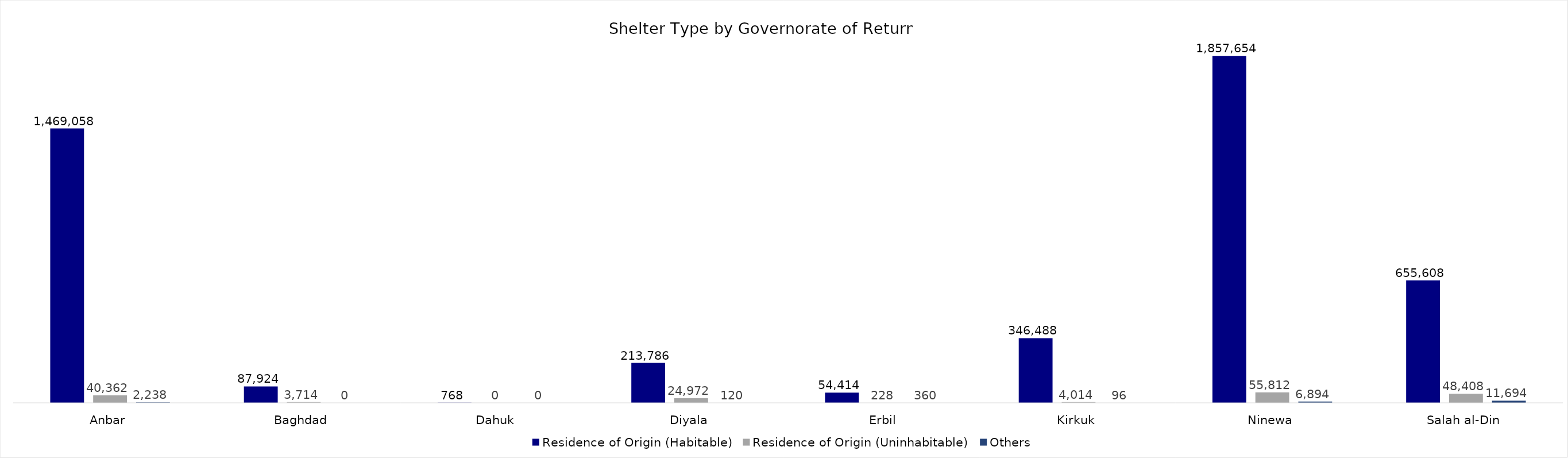
| Category | Residence of Origin (Habitable) | Residence of Origin (Uninhabitable) | Others |
|---|---|---|---|
| Anbar | 1469058 | 40362 | 2238 |
| Baghdad | 87924 | 3714 | 0 |
| Dahuk | 768 | 0 | 0 |
| Diyala | 213786 | 24972 | 120 |
| Erbil | 54414 | 228 | 360 |
| Kirkuk | 346488 | 4014 | 96 |
| Ninewa | 1857654 | 55812 | 6894 |
| Salah al-Din | 655608 | 48408 | 11694 |